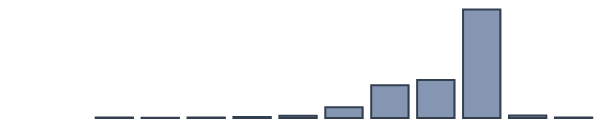
| Category | Series 0 |
|---|---|
| 0 | 0 |
| 1 | 0 |
| 2 | 0.2 |
| 3 | 0.1 |
| 4 | 0.2 |
| 5 | 0.5 |
| 6 | 1.1 |
| 7 | 5.5 |
| 8 | 16.6 |
| 9 | 19.3 |
| 10 | 55.2 |
| 11 | 1.3 |
| 12 | 0.3 |